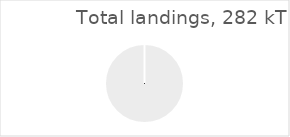
| Category | Western Med. |
|---|---|
| 0 | 282.037 |